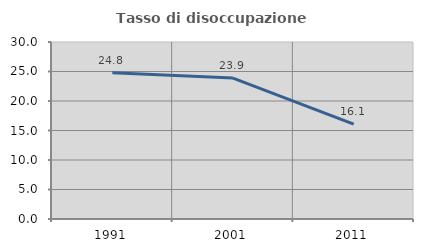
| Category | Tasso di disoccupazione giovanile  |
|---|---|
| 1991.0 | 24.786 |
| 2001.0 | 23.881 |
| 2011.0 | 16.092 |